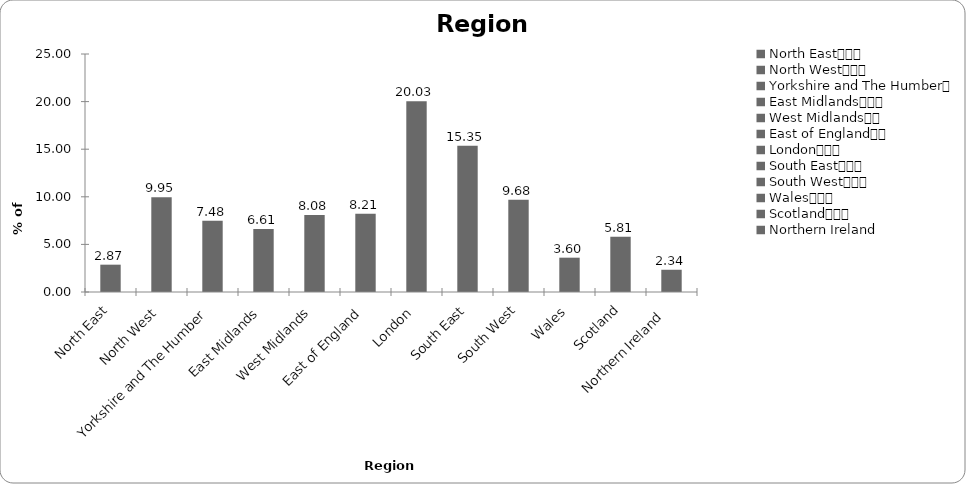
| Category | Region |
|---|---|
| North East			 | 2.87 |
| North West			 | 9.947 |
| Yorkshire and The Humber	 | 7.477 |
| East Midlands			 | 6.609 |
| West Midlands		 | 8.077 |
| East of England		 | 8.211 |
| London			 | 20.027 |
| South East			 | 15.354 |
| South West			 | 9.68 |
| Wales			 | 3.605 |
| Scotland			 | 5.808 |
| Northern Ireland  | 2.336 |